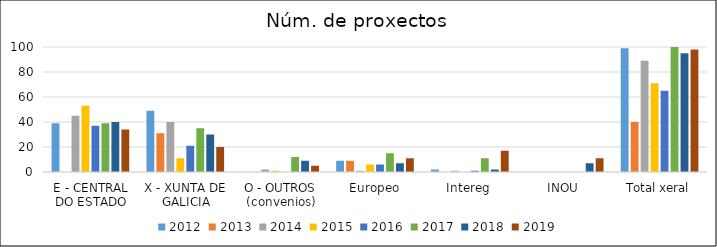
| Category | 2012 | 2013 | 2014 | 2015 | 2016 | 2017 | 2018 | 2019 |
|---|---|---|---|---|---|---|---|---|
| E - CENTRAL DO ESTADO | 39 | 0 | 45 | 53 | 37 | 39 | 40 | 34 |
| X - XUNTA DE GALICIA | 49 | 31 | 40 | 11 | 21 | 35 | 30 | 20 |
| O - OUTROS (convenios) | 0 | 0 | 2 | 1 | 0 | 12 | 9 | 5 |
| Europeo | 9 | 9 | 1 | 6 | 6 | 15 | 7 | 11 |
| Intereg | 2 | 0 | 1 | 0 | 1 | 11 | 2 | 17 |
| INOU | 0 | 0 | 0 | 0 | 0 | 0 | 7 | 11 |
| Total xeral | 99 | 40 | 89 | 71 | 65 | 112 | 95 | 98 |